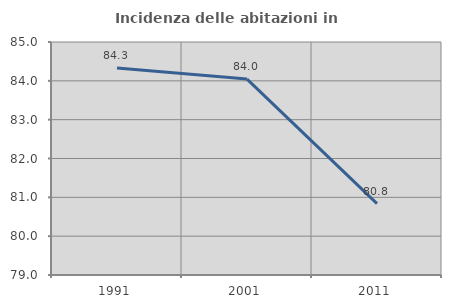
| Category | Incidenza delle abitazioni in proprietà  |
|---|---|
| 1991.0 | 84.333 |
| 2001.0 | 84.046 |
| 2011.0 | 80.84 |